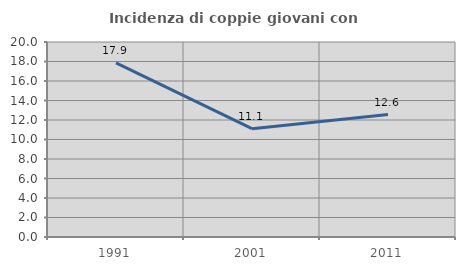
| Category | Incidenza di coppie giovani con figli |
|---|---|
| 1991.0 | 17.857 |
| 2001.0 | 11.111 |
| 2011.0 | 12.56 |